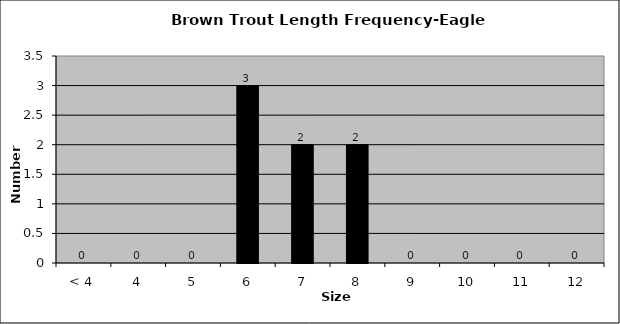
| Category | Series 0 |
|---|---|
| < 4 | 0 |
| 4 | 0 |
| 5 | 0 |
| 6 | 3 |
| 7 | 2 |
| 8 | 2 |
| 9 | 0 |
| 10 | 0 |
| 11 | 0 |
| 12 | 0 |